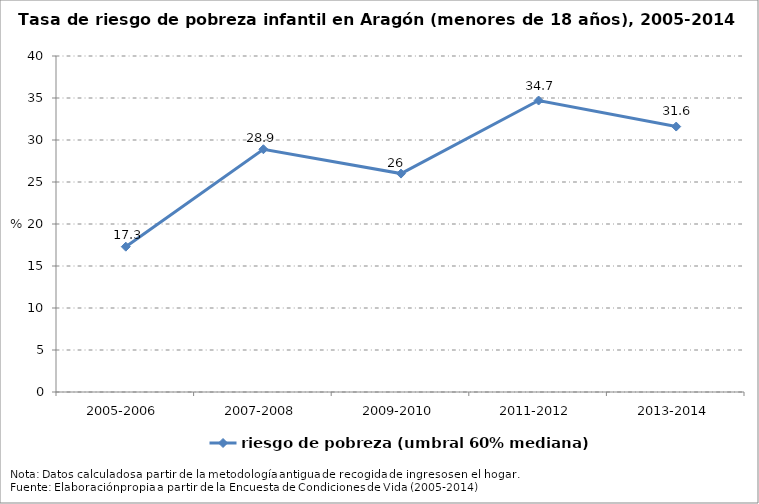
| Category | riesgo de pobreza (umbral 60% mediana) |
|---|---|
| 2005-2006 | 17.3 |
| 2007-2008 | 28.9 |
| 2009-2010 | 26 |
| 2011-2012 | 34.7 |
| 2013-2014 | 31.6 |